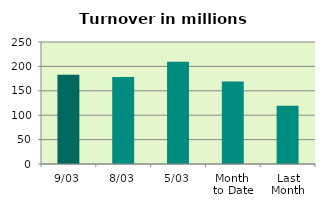
| Category | Series 0 |
|---|---|
| 9/03 | 182.674 |
| 8/03 | 178.119 |
| 5/03 | 209.6 |
| Month 
to Date | 168.876 |
| Last
Month | 119.242 |